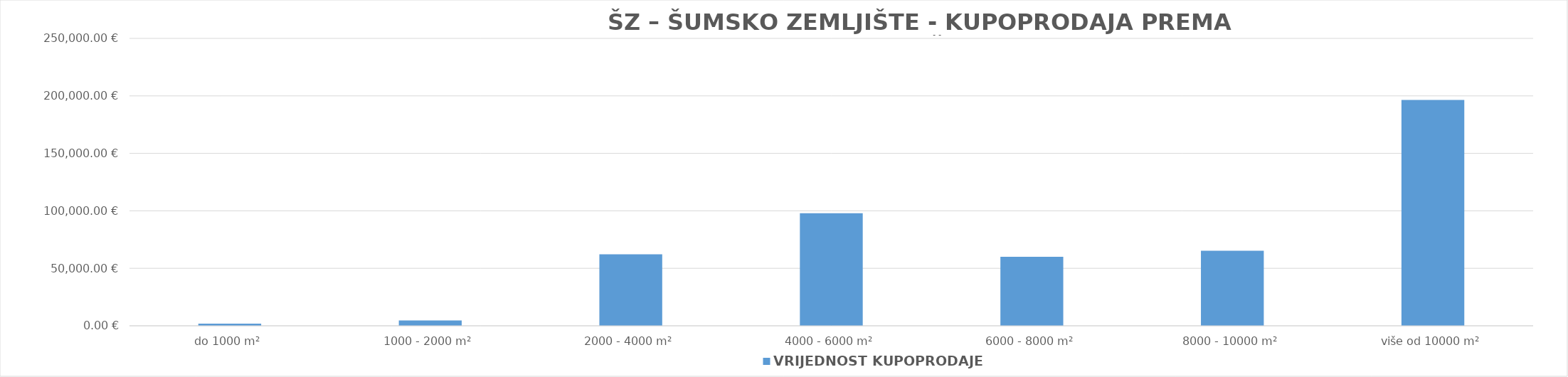
| Category | VRIJEDNOST KUPOPRODAJE 
(u EUR) |
|---|---|
| do 1000 m² | 1932.72 |
| 1000 - 2000 m² | 4705.001 |
| 2000 - 4000 m² | 62232.631 |
| 4000 - 6000 m² | 97882.451 |
| 6000 - 8000 m² | 60064.461 |
| 8000 - 10000 m² | 65324 |
| više od 10000 m² | 196455.322 |